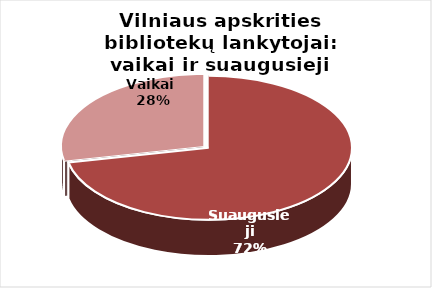
| Category | Series 0 |
|---|---|
| Suaugusieji | 1288700 |
| Vaikai  | 507957 |